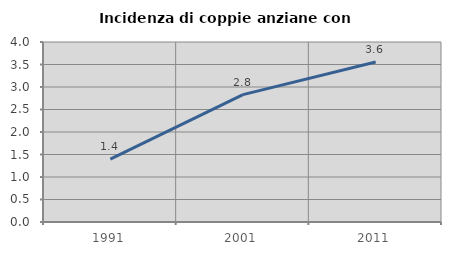
| Category | Incidenza di coppie anziane con figli |
|---|---|
| 1991.0 | 1.398 |
| 2001.0 | 2.831 |
| 2011.0 | 3.555 |